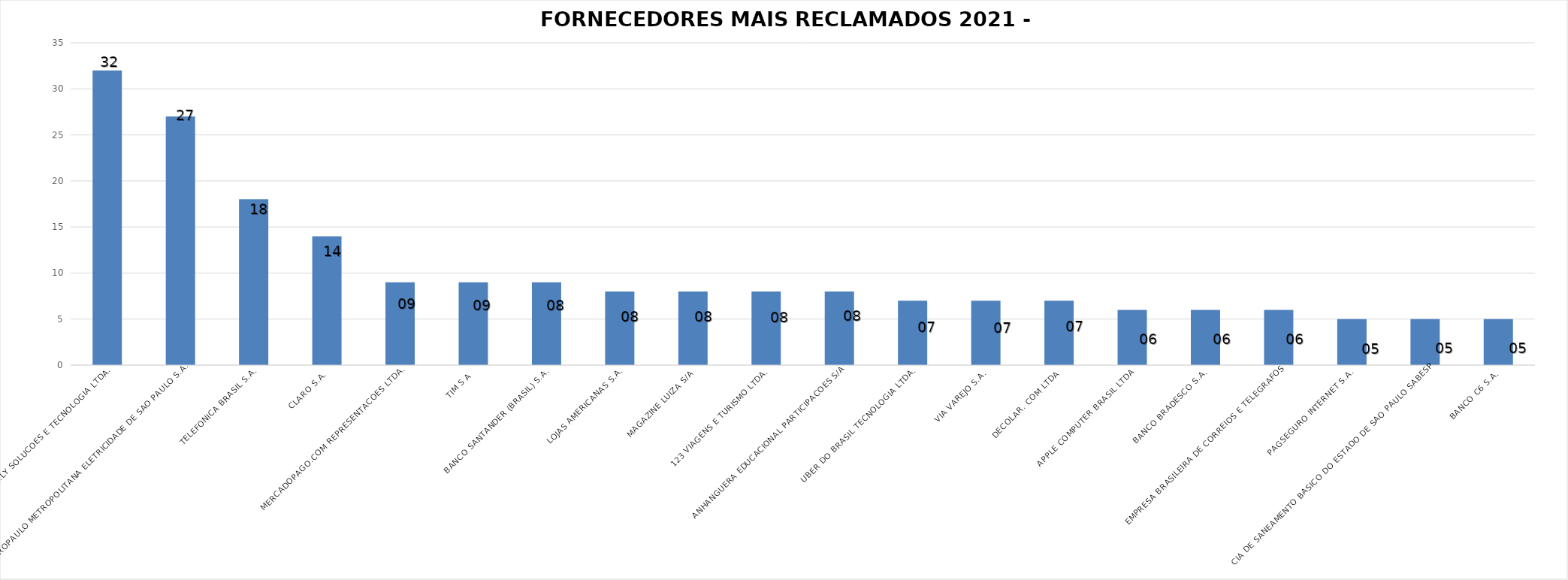
| Category | Series 0 |
|---|---|
| FACI.LY SOLUCOES E TECNOLOGIA LTDA. | 32 |
| ELETROPAULO METROPOLITANA ELETRICIDADE DE SAO PAULO S.A. | 27 |
| TELEFONICA BRASIL S.A. | 18 |
| CLARO S.A. | 14 |
| MERCADOPAGO.COM REPRESENTACOES LTDA. | 9 |
| TIM S A | 9 |
| BANCO SANTANDER (BRASIL) S.A. | 9 |
| LOJAS AMERICANAS S.A. | 8 |
| MAGAZINE LUIZA S/A | 8 |
| 123 VIAGENS E TURISMO LTDA. | 8 |
| ANHANGUERA EDUCACIONAL PARTICIPACOES S/A | 8 |
| UBER DO BRASIL TECNOLOGIA LTDA. | 7 |
| VIA VAREJO S.A. | 7 |
| DECOLAR. COM LTDA | 7 |
| APPLE COMPUTER BRASIL LTDA | 6 |
| BANCO BRADESCO S.A. | 6 |
| EMPRESA BRASILEIRA DE CORREIOS E TELEGRAFOS | 6 |
| PAGSEGURO INTERNET S.A. | 5 |
| CIA DE SANEAMENTO BASICO DO ESTADO DE SAO PAULO SABESP | 5 |
| BANCO C6 S.A. | 5 |